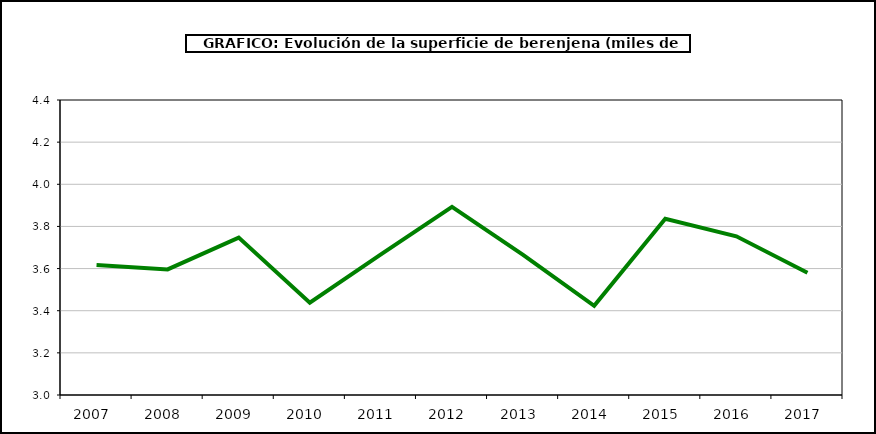
| Category | superficie |
|---|---|
| 2007.0 | 3.617 |
| 2008.0 | 3.596 |
| 2009.0 | 3.747 |
| 2010.0 | 3.438 |
| 2011.0 | 3.667 |
| 2012.0 | 3.893 |
| 2013.0 | 3.665 |
| 2014.0 | 3.423 |
| 2015.0 | 3.836 |
| 2016.0 | 3.753 |
| 2017.0 | 3.58 |